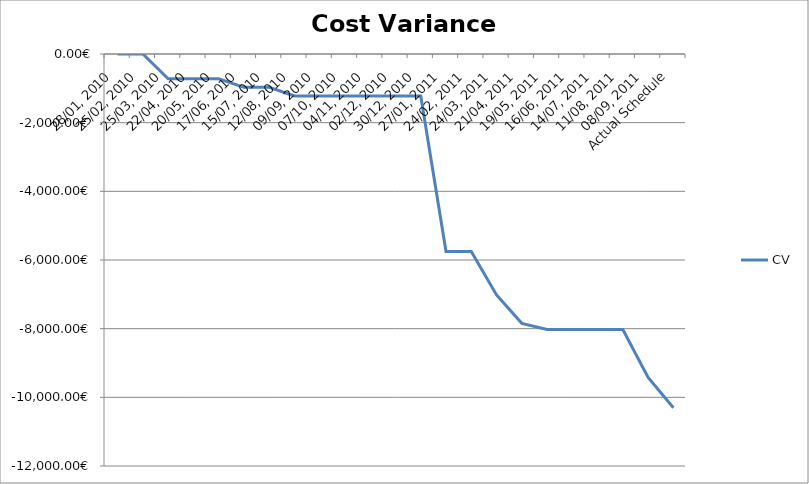
| Category | CV |
|---|---|
| 28/01, 2010 | 0 |
| 25/02, 2010 | 0 |
| 25/03, 2010 | -721.44 |
| 22/04, 2010 | -721.44 |
| 20/05, 2010 | -721.44 |
| 17/06, 2010 | -971.68 |
| 15/07, 2010 | -971.68 |
| 12/08, 2010 | -1221.92 |
| 09/09, 2010 | -1221.92 |
| 07/10, 2010 | -1221.92 |
| 04/11, 2010 | -1221.92 |
| 02/12, 2010 | -1221.92 |
| 30/12, 2010 | -1221.92 |
| 27/01, 2011 | -5755.68 |
| 24/02, 2011 | -5755.68 |
| 24/03, 2011 | -7016.48 |
| 21/04, 2011 | -7845.097 |
| 19/05, 2011 | -8023.84 |
| 16/06, 2011 | -8023.84 |
| 14/07, 2011 | -8023.84 |
| 11/08, 2011 | -8023.84 |
| 08/09, 2011 | -9421.78 |
| Actual Schedule | -10305.62 |